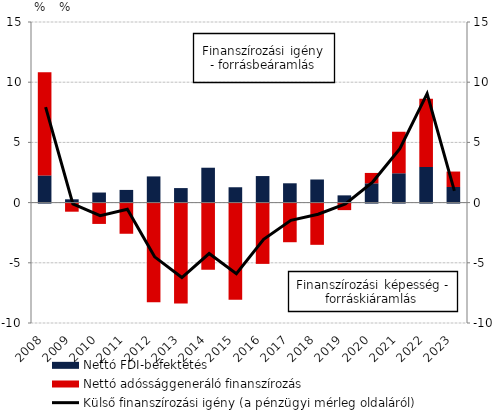
| Category | Nettó FDI-befektetés | Nettó adóssággeneráló finanszírozás |
|---|---|---|
| 2008.0 | 2.256 | 8.562 |
| 2009.0 | 0.274 | -0.756 |
| 2010.0 | 0.837 | -1.772 |
| 2011.0 | 1.053 | -2.588 |
| 2012.0 | 2.175 | -8.282 |
| 2013.0 | 1.206 | -8.378 |
| 2014.0 | 2.897 | -5.584 |
| 2015.0 | 1.275 | -8.078 |
| 2016.0 | 2.205 | -5.09 |
| 2017.0 | 1.604 | -3.291 |
| 2018.0 | 1.919 | -3.507 |
| 2019.0 | 0.601 | -0.625 |
| 2020.0 | 1.603 | 0.861 |
| 2021.0 | 2.437 | 3.447 |
| 2022.0 | 2.961 | 5.666 |
| 2023.0 | 1.296 | 1.283 |